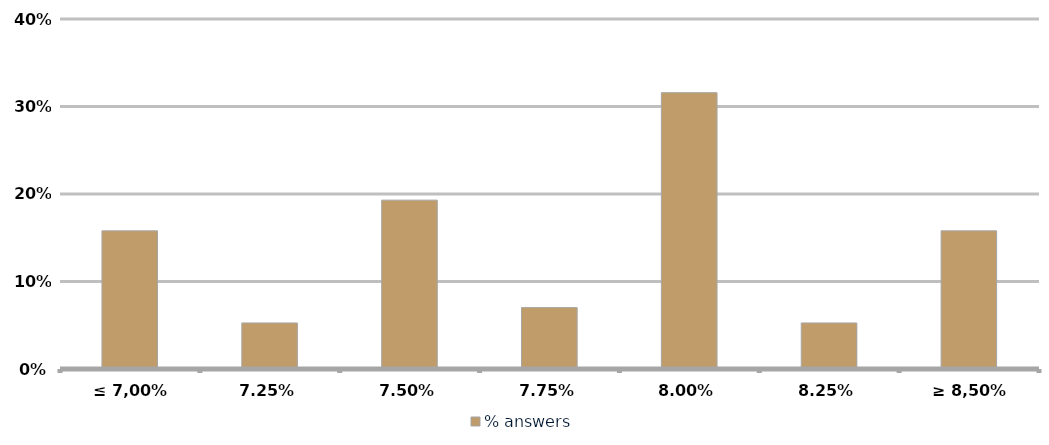
| Category | % answers |
|---|---|
| ≤ 7,00% | 0.158 |
| 7,25% | 0.053 |
| 7,50% | 0.193 |
| 7,75% | 0.07 |
| 8,00% | 0.316 |
| 8,25% | 0.053 |
| ≥ 8,50% | 0.158 |